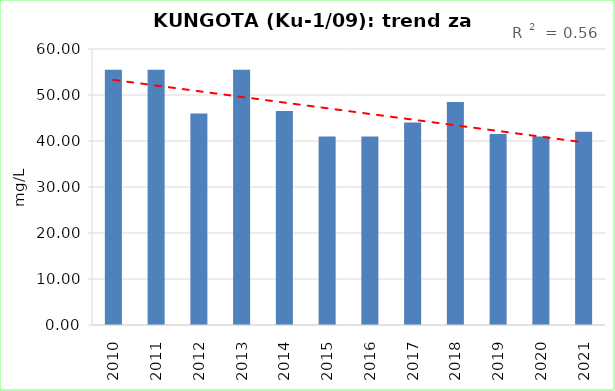
| Category | Vsota |
|---|---|
| 2010 | 55.5 |
| 2011 | 55.5 |
| 2012 | 46 |
| 2013 | 55.5 |
| 2014 | 46.5 |
| 2015 | 41 |
| 2016 | 41 |
| 2017 | 44 |
| 2018 | 48.5 |
| 2019 | 41.5 |
| 2020 | 41 |
| 2021 | 42 |